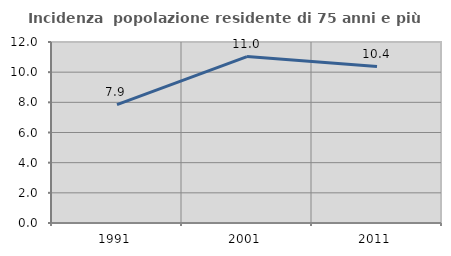
| Category | Incidenza  popolazione residente di 75 anni e più |
|---|---|
| 1991.0 | 7.852 |
| 2001.0 | 11.033 |
| 2011.0 | 10.37 |